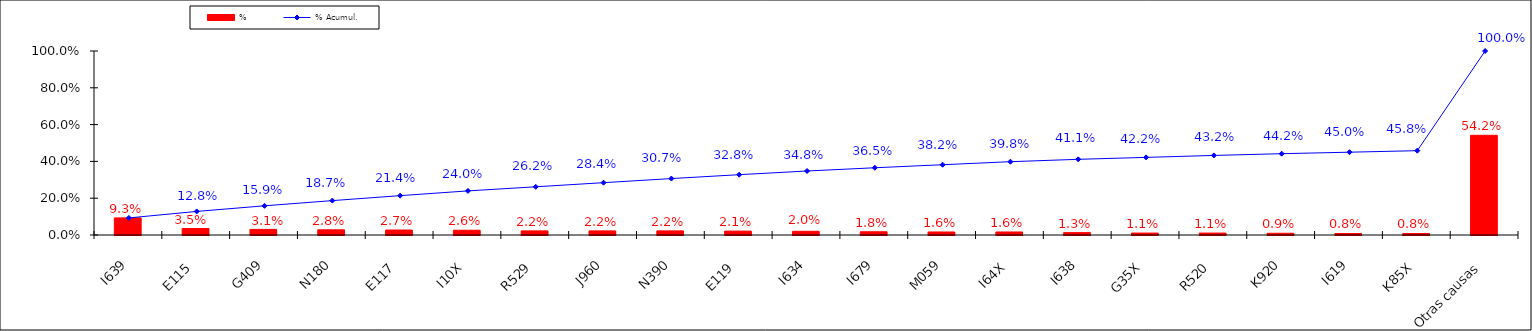
| Category | % |
|---|---|
| I639 | 0.093 |
| E115 | 0.035 |
| G409 | 0.031 |
| N180 | 0.028 |
| E117 | 0.027 |
| I10X | 0.026 |
| R529 | 0.022 |
| J960 | 0.022 |
| N390 | 0.022 |
| E119 | 0.021 |
| I634 | 0.02 |
| I679 | 0.018 |
| M059 | 0.016 |
| I64X | 0.016 |
| I638 | 0.013 |
| G35X | 0.011 |
| R520 | 0.011 |
| K920 | 0.009 |
| I619 | 0.008 |
| K85X | 0.008 |
| Otras causas | 0.542 |